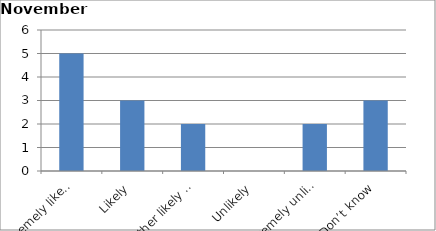
| Category | Series 0 |
|---|---|
| Extremely likely | 5 |
| Likely | 3 |
| Neither likely nor unlikely | 2 |
| Unlikely | 0 |
| Extremely unlikely | 2 |
| Don’t know | 3 |